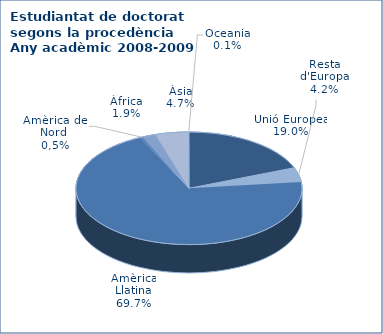
| Category | 2008-2009 |
|---|---|
| Unió Europea | 291 |
| Resta d'Europa | 64 |
| Amèrica Llatina | 1065 |
| Amèrica del Nord (1) | 6 |
| Àfrica | 29 |
| Àsia | 72 |
| Oceania | 1 |